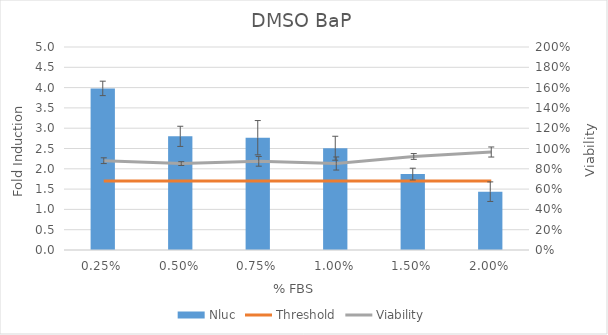
| Category | Nluc |
|---|---|
| 0.0025 | 3.98 |
| 0.005 | 2.799 |
| 0.0075 | 2.766 |
| 0.01 | 2.507 |
| 0.015 | 1.869 |
| 0.02 | 1.437 |